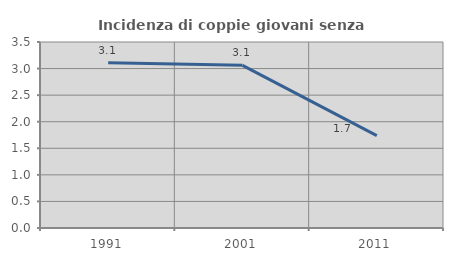
| Category | Incidenza di coppie giovani senza figli |
|---|---|
| 1991.0 | 3.111 |
| 2001.0 | 3.061 |
| 2011.0 | 1.737 |